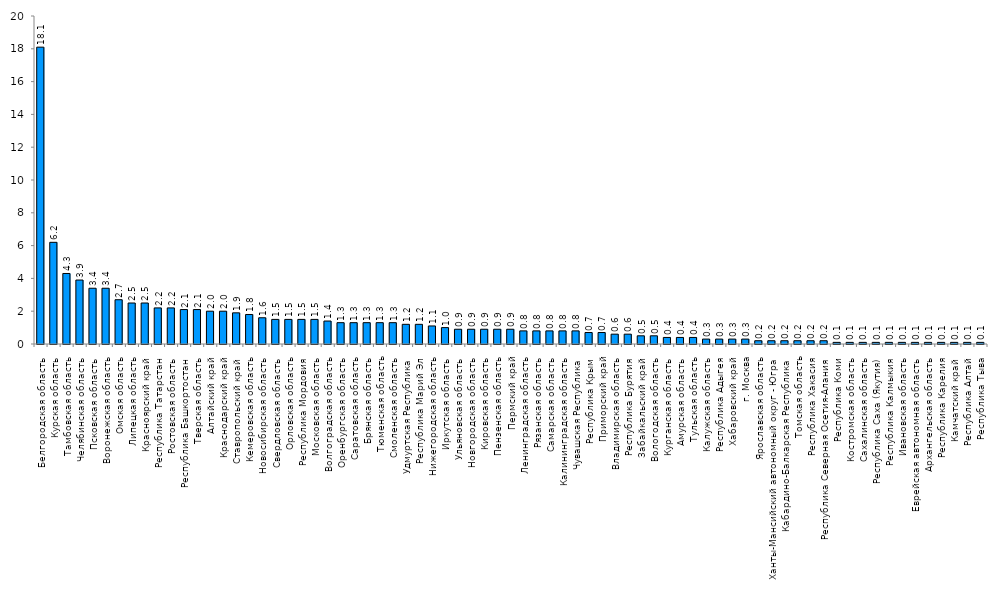
| Category | Series 0 |
|---|---|
| Белгородская область | 18.1 |
| Курская область | 6.2 |
| Тамбовская область | 4.3 |
| Челябинская область | 3.9 |
| Псковская область | 3.4 |
| Воронежская область | 3.4 |
| Омская область | 2.7 |
| Липецкая область | 2.5 |
| Красноярский край | 2.5 |
| Республика Татарстан | 2.2 |
| Ростовская область | 2.2 |
| Республика Башкортостан | 2.1 |
| Тверская область | 2.1 |
| Алтайский край | 2 |
| Краснодарский край | 2 |
| Ставропольский край | 1.9 |
| Кемеровская область | 1.8 |
| Новосибирская область | 1.6 |
| Свердловская область | 1.5 |
| Орловская область | 1.5 |
| Республика Мордовия | 1.5 |
| Московская область | 1.5 |
| Волгоградская область | 1.4 |
| Оренбургская область | 1.3 |
| Саратовская область | 1.3 |
| Брянская область | 1.3 |
| Тюменская область | 1.3 |
| Смоленская область | 1.3 |
| Удмуртская Республика | 1.2 |
| Республика Марий Эл | 1.2 |
| Нижегородская область | 1.1 |
| Иркутская область | 1 |
| Ульяновская область | 0.9 |
| Новгородская область | 0.9 |
| Кировская область | 0.9 |
| Пензенская область | 0.9 |
| Пермский край | 0.9 |
| Ленинградская область | 0.8 |
| Рязанская область | 0.8 |
| Самарская область | 0.8 |
| Калининградская область | 0.8 |
| Чувашская Республика | 0.8 |
| Республика Крым | 0.7 |
| Приморский край | 0.7 |
| Владимирская область | 0.6 |
| Республика Бурятия | 0.6 |
| Забайкальский край | 0.5 |
| Вологодская область | 0.5 |
| Курганская область | 0.4 |
| Амурская область | 0.4 |
| Тульская область | 0.4 |
| Калужская область | 0.3 |
| Республика Адыгея | 0.3 |
| Хабаровский край | 0.3 |
| г. Москва | 0.3 |
| Ярославская область | 0.2 |
| Ханты-Мансийский автономный округ - Югра | 0.2 |
| Кабардино-Балкарская Республика | 0.2 |
| Томская область | 0.2 |
| Республика Хакасия | 0.2 |
| Республика Северная Осетия-Алания | 0.2 |
| Республика Коми | 0.1 |
| Костромская область | 0.1 |
| Сахалинская область | 0.1 |
| Республика Саха (Якутия) | 0.1 |
| Республика Калмыкия | 0.1 |
| Ивановская область | 0.1 |
| Еврейская автономная область | 0.1 |
| Архангельская область | 0.1 |
| Республика Карелия | 0.1 |
| Камчатский край | 0.1 |
| Республика Алтай | 0.1 |
| Республика Тыва | 0.1 |